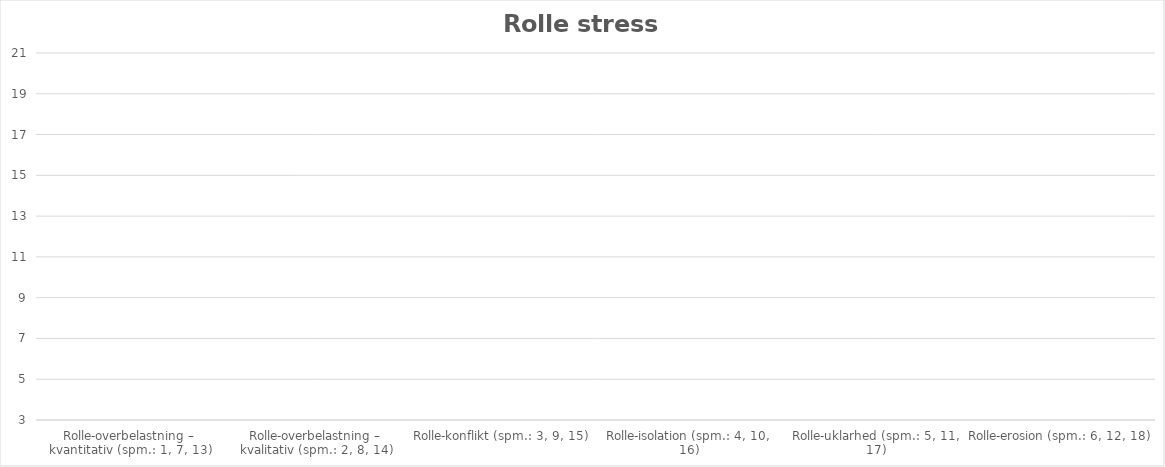
| Category | Samlet score |
|---|---|
| Rolle-overbelastning – kvantitativ (spm.: 1, 7, 13) | 0 |
| Rolle-overbelastning – kvalitativ (spm.: 2, 8, 14) | 0 |
| Rolle-konflikt (spm.: 3, 9, 15) | 0 |
| Rolle-isolation (spm.: 4, 10, 16) | 0 |
| Rolle-uklarhed (spm.: 5, 11, 17) | 0 |
| Rolle-erosion (spm.: 6, 12, 18) | 0 |